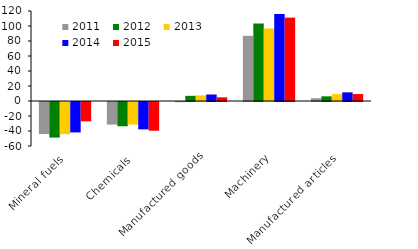
| Category | 2011 | 2012 | 2013 | 2014 | 2015 |
|---|---|---|---|---|---|
| Mineral fuels | -42.717 | -47.438 | -42.866 | -40.544 | -25.74 |
| Chemicals | -30.132 | -32.337 | -30.148 | -36.481 | -38.312 |
| Manufactured goods | -0.348 | 6.895 | 7.489 | 8.67 | 4.917 |
| Machinery | 86.957 | 103.345 | 96.733 | 116.106 | 111.182 |
| Manufactured articles | 3.679 | 6.22 | 9.229 | 11.537 | 9.28 |